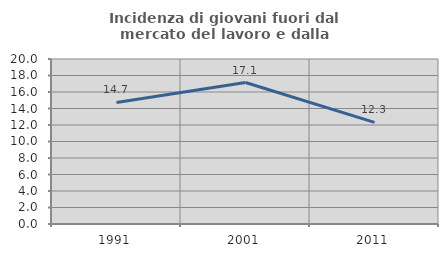
| Category | Incidenza di giovani fuori dal mercato del lavoro e dalla formazione  |
|---|---|
| 1991.0 | 14.733 |
| 2001.0 | 17.145 |
| 2011.0 | 12.317 |